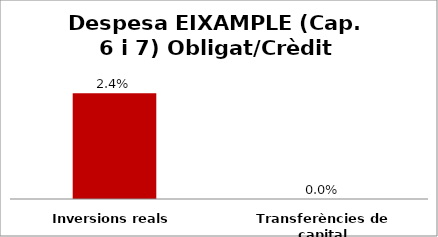
| Category | Series 0 |
|---|---|
| Inversions reals | 0.024 |
| Transferències de capital | 0 |